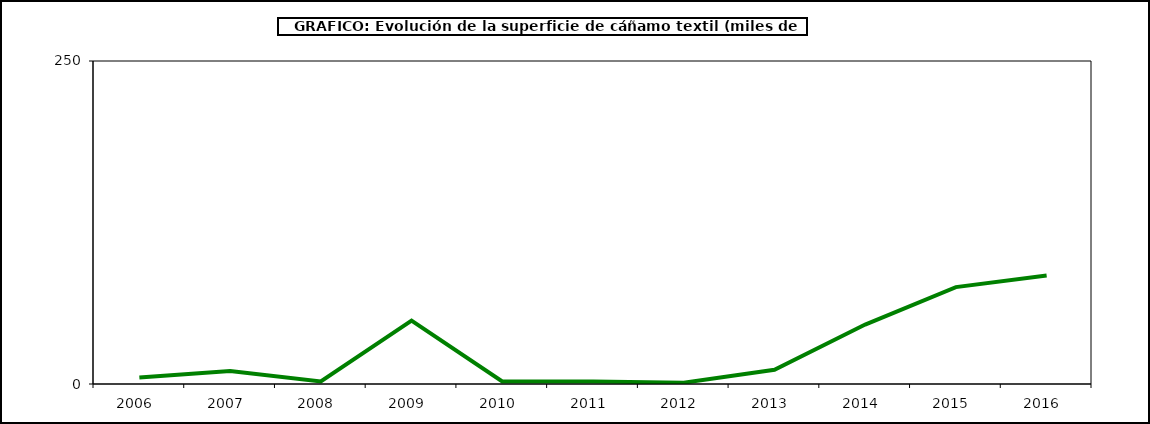
| Category | Superficie |
|---|---|
| 2006.0 | 5 |
| 2007.0 | 10 |
| 2008.0 | 2 |
| 2009.0 | 49 |
| 2010.0 | 2 |
| 2011.0 | 2 |
| 2012.0 | 1 |
| 2013.0 | 11 |
| 2014.0 | 46 |
| 2015.0 | 75 |
| 2016.0 | 84 |